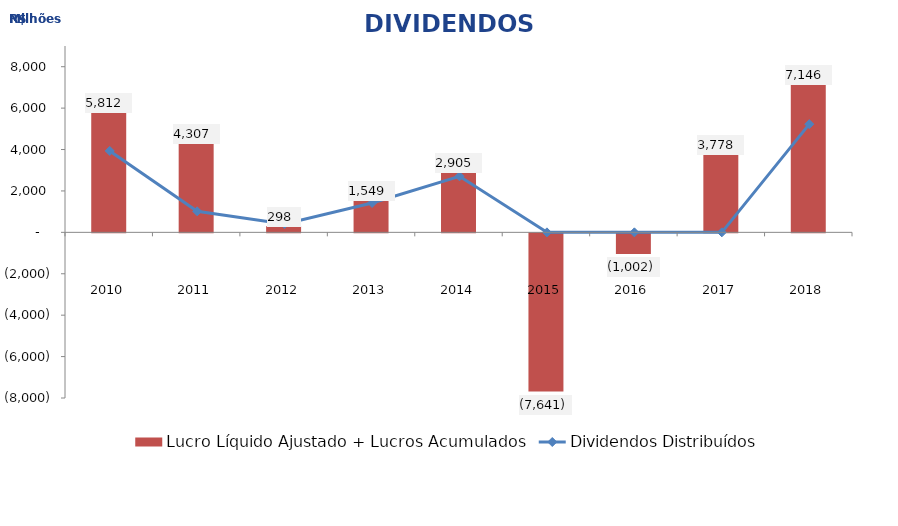
| Category | Lucro Líquido Ajustado + Lucros Acumulados |
|---|---|
| 2010 | 5812 |
| 2011 | 4306.5 |
| 2012 | 298 |
| 2013 | 1548.564 |
| 2014 | 2904.847 |
| 2015 | -7640.593 |
| 2016 | -1001.967 |
| 2017 | 3777.976 |
| 2018 | 7146 |